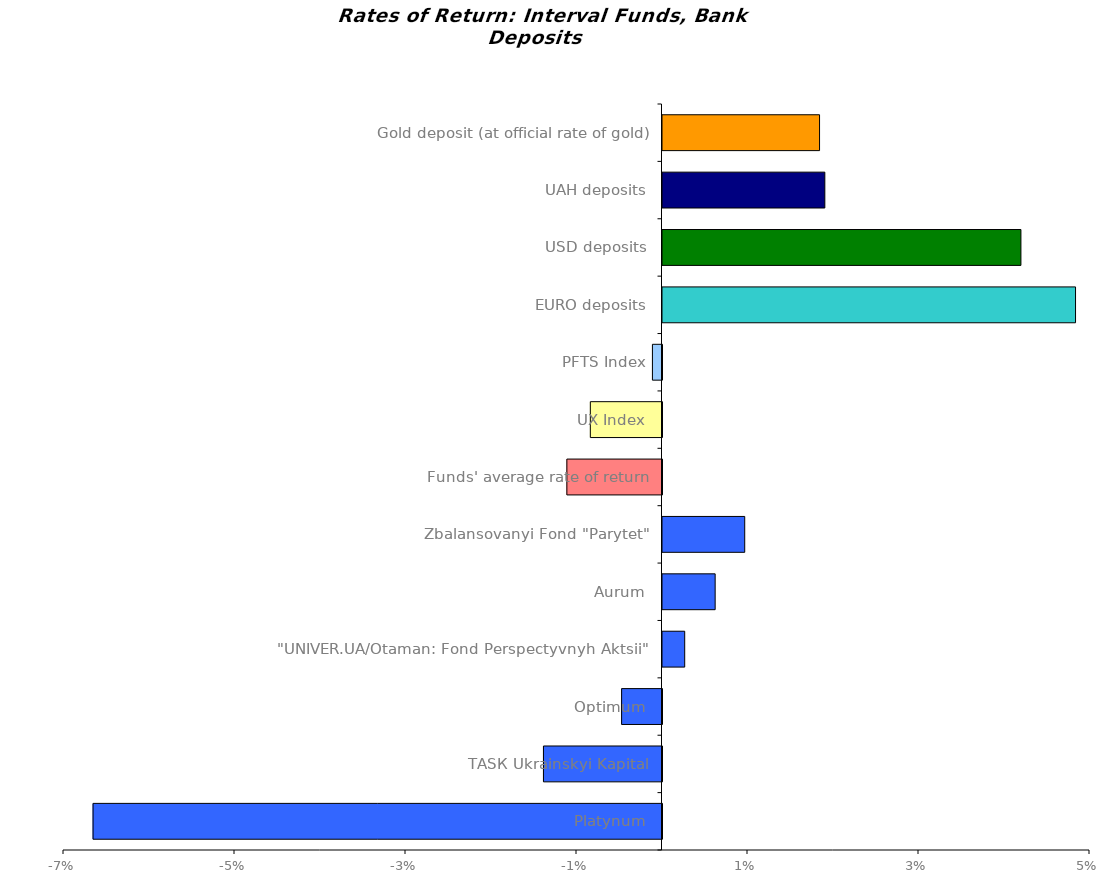
| Category | Series 0 |
|---|---|
| Platynum | -0.067 |
| ТАSК Ukrainskyi Kapital | -0.014 |
| Optimum | -0.005 |
| "UNIVER.UA/Otaman: Fond Perspectyvnyh Aktsii"  | 0.003 |
| Аurum | 0.006 |
| Zbalansovanyi Fond "Parytet" | 0.01 |
| Funds' average rate of return | -0.011 |
| UX Index | -0.008 |
| PFTS Index | -0.001 |
| EURO deposits | 0.048 |
| USD deposits | 0.042 |
| UAH deposits | 0.019 |
| Gold deposit (at official rate of gold) | 0.018 |